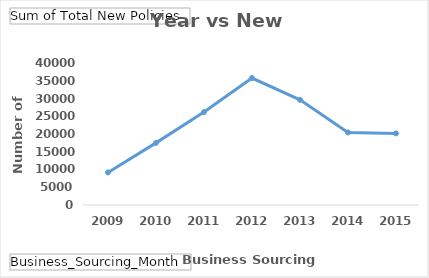
| Category | Total |
|---|---|
| 2009 | 9178 |
| 2010 | 17498 |
| 2011 | 26177 |
| 2012 | 35760 |
| 2013 | 29631 |
| 2014 | 20436 |
| 2015 | 20165 |